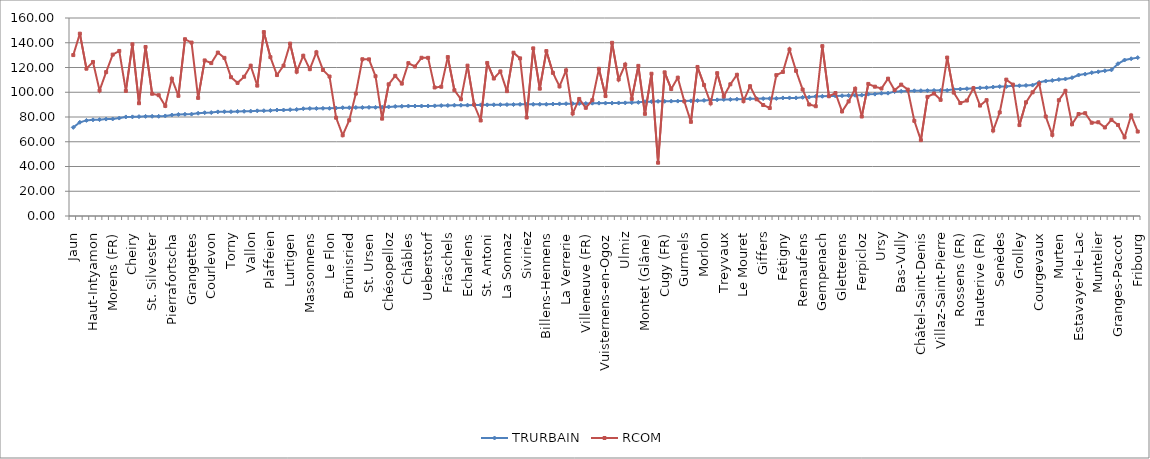
| Category | TRURBAIN | RCOM |
|---|---|---|
| Jaun | 71.604 | 130.044 |
| Russy | 75.71 | 147.336 |
| Hauteville | 77.242 | 119.064 |
| Haut-Intyamon | 77.717 | 124.467 |
| Plasselb | 77.859 | 101.418 |
| Grandvillard | 78.328 | 116.266 |
| Morens (FR) | 78.416 | 130.411 |
| Autafond | 79.143 | 133.376 |
| Bas-Intyamon | 80.055 | 101.106 |
| Cheiry | 80.11 | 138.762 |
| Val-de-Charmey | 80.296 | 91.122 |
| Prévondavaux | 80.51 | 136.575 |
| St. Silvester | 80.553 | 98.782 |
| Arconciel | 80.566 | 97.612 |
| Crésuz | 80.85 | 88.948 |
| Pierrafortscha | 81.605 | 110.919 |
| Villarsel-sur-Marly | 82.045 | 97.106 |
| Surpierre | 82.231 | 142.853 |
| Grangettes | 82.331 | 140.15 |
| Châtel-sur-Montsalvens | 83.036 | 95.442 |
| Chapelle (Glâne) | 83.462 | 125.712 |
| Courlevon | 83.609 | 123.55 |
| Ecublens (FR) | 84.146 | 132.049 |
| Barberêche | 84.256 | 127.776 |
| Torny | 84.259 | 112.168 |
| Léchelles | 84.504 | 107.556 |
| Villarepos | 84.591 | 112.535 |
| Vallon | 84.731 | 121.44 |
| Vuissens | 85.012 | 105.359 |
| Le Châtelard | 85.076 | 148.62 |
| Plaffeien | 85.23 | 128.376 |
| Villorsonnens | 85.634 | 113.893 |
| Semsales | 85.647 | 121.512 |
| Lurtigen | 85.929 | 139.312 |
| Autigny | 86.079 | 116.624 |
| Saint-Martin (FR) | 86.676 | 129.518 |
| Massonnens | 86.902 | 118.655 |
| Galmiz | 86.905 | 132.281 |
| Rechthalten | 87.005 | 117.996 |
| Le Flon | 87.03 | 112.697 |
| Pont-la-Ville | 87.225 | 79.434 |
| Wallenried | 87.514 | 65.244 |
| Brünisried | 87.524 | 77.385 |
| Nuvilly | 87.659 | 98.911 |
| Vuisternens-devant-Romont | 87.689 | 126.671 |
| St. Ursen | 87.789 | 126.603 |
| La Folliaz | 87.791 | 112.947 |
| Vernay | 87.922 | 78.673 |
| Chésopelloz | 88.165 | 106.418 |
| Mézières (FR) | 88.504 | 113.267 |
| Montagny (FR) | 88.663 | 106.992 |
| Châbles | 88.843 | 123.511 |
| Châtonnaye | 88.852 | 120.794 |
| Murist | 88.889 | 127.842 |
| Ueberstorf | 88.911 | 127.81 |
| Châtillon (FR) | 89.013 | 103.862 |
| Ponthaux | 89.258 | 104.43 |
| Fräschels | 89.323 | 128.433 |
| Pont-en-Ogoz | 89.531 | 101.661 |
| Ependes (FR) | 89.535 | 94.364 |
| Echarlens | 89.57 | 121.487 |
| Corbières | 89.65 | 90.068 |
| Prez-vers-Noréaz | 89.775 | 77.195 |
| St. Antoni | 89.809 | 123.682 |
| Salvenach | 89.884 | 111.097 |
| Kleinbösingen | 89.971 | 116.823 |
| La Sonnaz | 90.02 | 100.877 |
| Rueyres-les-Prés | 90.075 | 131.93 |
| Alterswil | 90.204 | 127.378 |
| Siviriez | 90.211 | 79.585 |
| Heitenried | 90.272 | 135.455 |
| La Roche | 90.283 | 102.903 |
| Billens-Hennens | 90.295 | 133.267 |
| Rue | 90.479 | 115.667 |
| Le Glèbe | 90.597 | 104.723 |
| La Verrerie | 90.749 | 117.68 |
| Chénens | 90.794 | 82.821 |
| La Brillaz | 90.893 | 94.593 |
| Villeneuve (FR) | 90.917 | 87.432 |
| Corpataux-Magnedens | 91.164 | 93.646 |
| Auboranges | 91.189 | 118.982 |
| Vuisternens-en-Ogoz | 91.233 | 96.932 |
| Ménières | 91.245 | 139.955 |
| Sorens | 91.34 | 110.291 |
| Ulmiz | 91.423 | 122.412 |
| Corserey | 91.617 | 94.622 |
| Zumholz | 91.827 | 121.305 |
| Montet (Glâne) | 92.395 | 82.547 |
| Misery-Courtion | 92.4 | 114.956 |
| Lully (FR) | 92.671 | 43.065 |
| Cugy (FR) | 92.692 | 116.084 |
| Delley-Portalban | 92.818 | 102.598 |
| Sâles | 92.848 | 111.745 |
| Gurmels | 92.962 | 92.57 |
| Gruyères | 93.048 | 76.096 |
| Les Montets | 93.226 | 120.454 |
| Morlon | 93.405 | 105.798 |
| Botterens | 93.683 | 91.091 |
| Jeuss | 93.846 | 115.414 |
| Treyvaux | 94.15 | 96.647 |
| Noréaz | 94.164 | 106.421 |
| Haut-Vully | 94.411 | 114.108 |
| Le Mouret | 94.53 | 92.81 |
| Oberschrot | 94.804 | 104.896 |
| Le Pâquier (FR) | 94.847 | 94.315 |
| Giffers | 94.866 | 89.675 |
| Cottens (FR) | 94.941 | 87.257 |
| Vaulruz | 95.005 | 113.833 |
| Fétigny | 95.41 | 116.402 |
| Bussy (FR) | 95.42 | 134.585 |
| Dompierre (FR) | 95.45 | 117.33 |
| Remaufens | 95.881 | 102.201 |
| Neyruz (FR) | 96.079 | 90.09 |
| Cheyres | 96.657 | 88.711 |
| Gempenach | 96.738 | 137.253 |
| Vuadens | 96.897 | 96.79 |
| Greng | 96.963 | 99.378 |
| Gletterens | 97.201 | 84.476 |
| Saint-Aubin (FR) | 97.404 | 92.626 |
| Bösingen | 97.562 | 102.854 |
| Ferpicloz | 97.661 | 80.382 |
| Farvagny | 98.464 | 106.724 |
| Tentlingen | 98.497 | 104.499 |
| Ursy | 99.202 | 103.03 |
| Attalens | 99.257 | 110.964 |
| Bossonnens | 100.495 | 101.63 |
| Bas-Vully | 100.766 | 106.161 |
| Broc | 101.01 | 102.144 |
| Belfaux | 101.177 | 76.9 |
| Châtel-Saint-Denis | 101.272 | 61.28 |
| Granges (Veveyse) | 101.324 | 96.272 |
| Marsens | 101.451 | 98.969 |
| Villaz-Saint-Pierre | 101.526 | 93.884 |
| Ried bei Kerzers | 101.532 | 128.029 |
| Düdingen | 102.358 | 99.728 |
| Rossens (FR) | 102.571 | 91.275 |
| Schmitten (FR) | 102.87 | 93.297 |
| Wünnewil-Flamatt | 103.139 | 103.318 |
| Hauterive (FR) | 103.549 | 89.226 |
| Riaz | 103.72 | 93.61 |
| Corminboeuf | 104.207 | 69.066 |
| Senèdes | 104.589 | 83.713 |
| Cressier (FR) | 104.621 | 110.201 |
| Sévaz | 105.272 | 106.186 |
| Grolley | 105.277 | 73.478 |
| Tafers | 105.494 | 91.886 |
| Kerzers | 105.767 | 99.955 |
| Courgevaux | 108.016 | 107 |
| Avry | 109.049 | 80.42 |
| Marly | 109.548 | 65.6 |
| Murten | 110.272 | 93.588 |
| Domdidier | 110.742 | 101.144 |
| Romont (FR) | 111.771 | 74.107 |
| Estavayer-le-Lac | 113.91 | 82.399 |
| Matran | 114.655 | 83.074 |
| Meyriez | 115.78 | 75.36 |
| Muntelier | 116.519 | 75.746 |
| Bulle | 117.324 | 71.544 |
| Courtepin | 118.077 | 77.746 |
| Granges-Paccot | 123.046 | 73.564 |
| Villars-sur-Glâne | 126.041 | 63.602 |
| Givisiez | 127.074 | 81.272 |
| Fribourg | 127.973 | 68.243 |